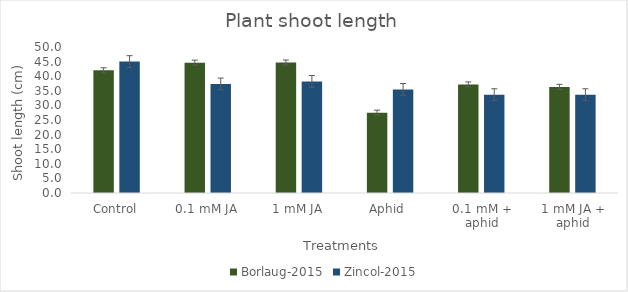
| Category | Borlaug-2015 | Zincol-2015 |
|---|---|---|
| Control | 42 | 45 |
| 0.1 mM JA | 44.633 | 37.333 |
| 1 mM JA | 44.667 | 38.2 |
| Aphid  | 27.5 | 35.467 |
| 0.1 mM + aphid | 37.167 | 33.667 |
| 1 mM JA + aphid | 36.333 | 33.667 |